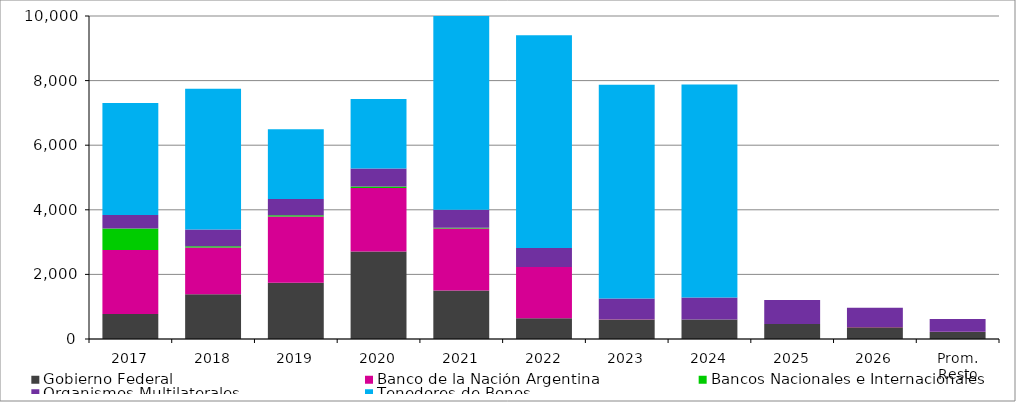
| Category | Gobierno Federal | Banco de la Nación Argentina | Bancos Nacionales e Internacionales | Organismos Multilaterales | Tenedores de Bonos |
|---|---|---|---|---|---|
| 2017 | 775.294 | 1980.877 | 661.593 | 421.451 | 3466.741 |
| 2018 | 1383.772 | 1452.045 | 38.102 | 515.722 | 4359.036 |
| 2019 | 1744.379 | 2046.9 | 42.301 | 500.88 | 2158.138 |
| 2020 | 2706.134 | 1970.091 | 45.494 | 560.569 | 2151.614 |
| 2021 | 1500.197 | 1919.875 | 23.629 | 561.361 | 6941.165 |
| 2022 | 639.714 | 1592.721 | 0 | 586.732 | 6588.499 |
| 2023 | 606.904 | 2.406 | 0 | 645.856 | 6613.353 |
| 2024 | 603.713 | 2.356 | 0 | 682.528 | 6594.345 |
| 2025 | 464.649 | 2.293 | 0 | 738.859 | 0 |
| 2026 | 367.245 | 2.237 | 0 | 594.811 | 0 |
| Prom. Resto | 219.176 | 1.913 | 0 | 396.828 | 0 |